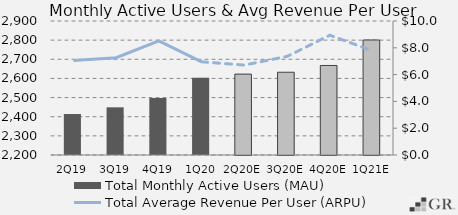
| Category | Total Monthly Active Users (MAU)  |
|---|---|
|  2Q19  | 2414 |
|  3Q19  | 2449 |
|  4Q19  | 2497.8 |
|  1Q20  | 2603 |
|  2Q20E  | 2622.579 |
|  3Q20E  | 2632.295 |
|  4Q20E  | 2667.631 |
|  1Q21E  | 2800.852 |